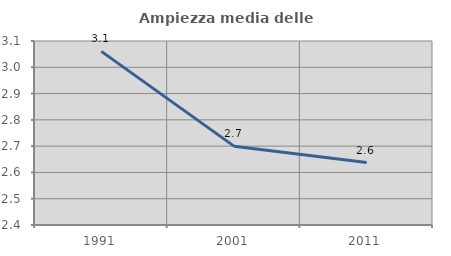
| Category | Ampiezza media delle famiglie |
|---|---|
| 1991.0 | 3.06 |
| 2001.0 | 2.7 |
| 2011.0 | 2.638 |